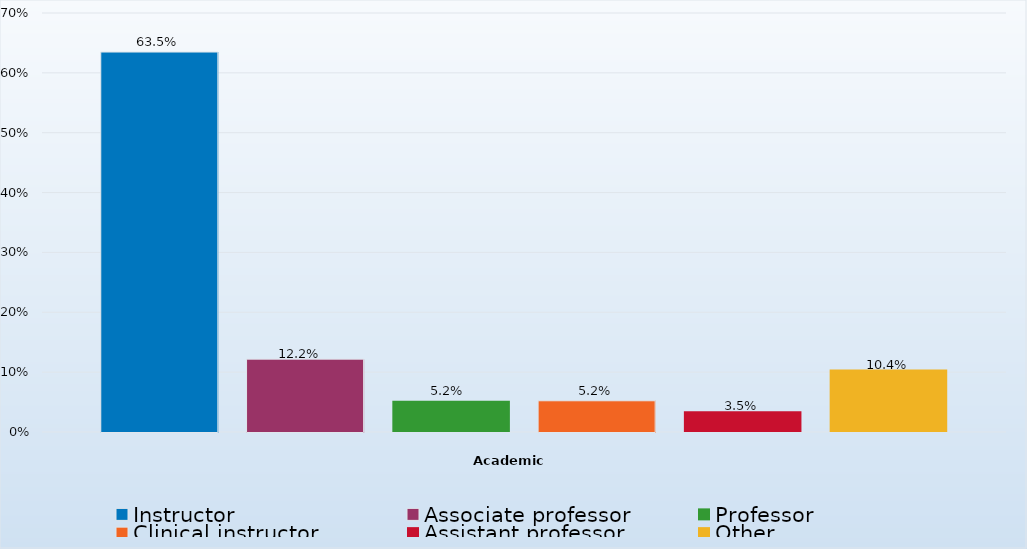
| Category | Instructor | Associate professor | Professor | Clinical instructor | Assistant professor | Other |
|---|---|---|---|---|---|---|
| 0 | 0.635 | 0.122 | 0.052 | 0.052 | 0.035 | 0.104 |